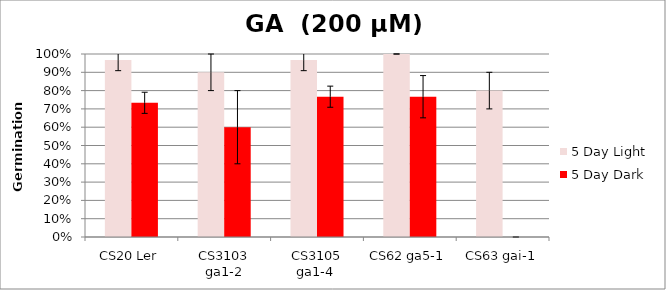
| Category | 5 Day Light | 5 Day Dark |
|---|---|---|
| CS20 Ler | 0.967 | 0.733 |
| CS3103 ga1-2 | 0.9 | 0.6 |
| CS3105 ga1-4  | 0.967 | 0.767 |
| CS62 ga5-1 | 1 | 0.767 |
| CS63 gai-1 | 0.8 | 0 |